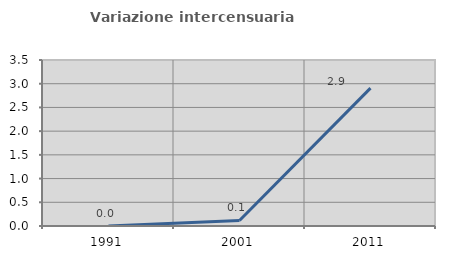
| Category | Variazione intercensuaria annua |
|---|---|
| 1991.0 | 0 |
| 2001.0 | 0.116 |
| 2011.0 | 2.907 |